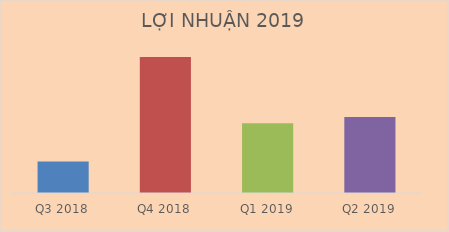
| Category | Doanh thu thuần |
|---|---|
| Q3 2018 | 166151798980 |
| Q4 2018 | 715902119821 |
| Q1 2019 | 367122649073 |
| Q2 2019 | 400478636048 |